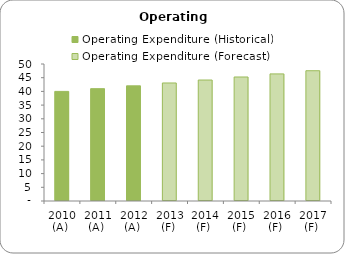
| Category | Operating Expenditure (Historical) | Operating Expenditure (Forecast) |
|---|---|---|
| 2010 (A)  | 40 | 0 |
| 2011 (A)  | 41 | 0 |
| 2012 (A)  | 42.025 | 0 |
| 2013 (F)  | 0 | 43.076 |
| 2014 (F)  | 0 | 44.153 |
| 2015 (F)  | 0 | 45.256 |
| 2016 (F)  | 0 | 46.388 |
| 2017 (F)  | 0 | 47.547 |